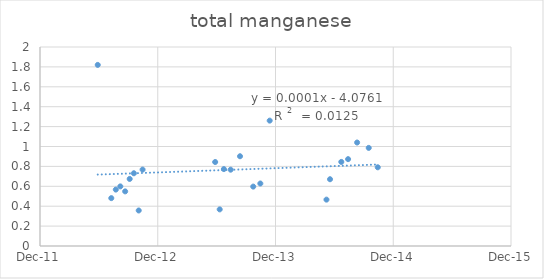
| Category | Series 0 |
|---|---|
| 41059.0 | 1.82 |
| 41101.0 | 0.481 |
| 41115.0 | 0.567 |
| 41129.0 | 0.599 |
| 41144.0 | 0.549 |
| 41158.0 | 0.674 |
| 41171.0 | 0.731 |
| 41186.0 | 0.357 |
| 41198.0 | 0.768 |
| 41423.0 | 0.844 |
| 41437.0 | 0.368 |
| 41450.0 | 0.773 |
| 41471.0 | 0.767 |
| 41500.0 | 0.902 |
| 41541.0 | 0.597 |
| 41563.0 | 0.628 |
| 41592.0 | 1.26 |
| 41768.0 | 0.466 |
| 41779.0 | 0.671 |
| 41814.0 | 0.845 |
| 41835.0 | 0.873 |
| 41863.0 | 1.04 |
| 41899.0 | 0.986 |
| 41927.0 | 0.791 |